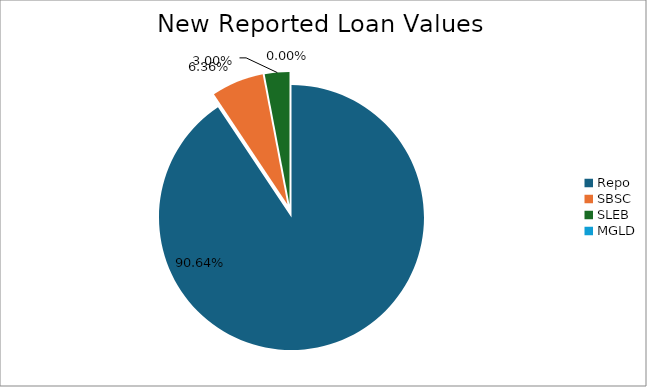
| Category | Series 0 |
|---|---|
| Repo | 12283495.222 |
| SBSC | 862353.522 |
| SLEB | 406367.262 |
| MGLD | 273.517 |